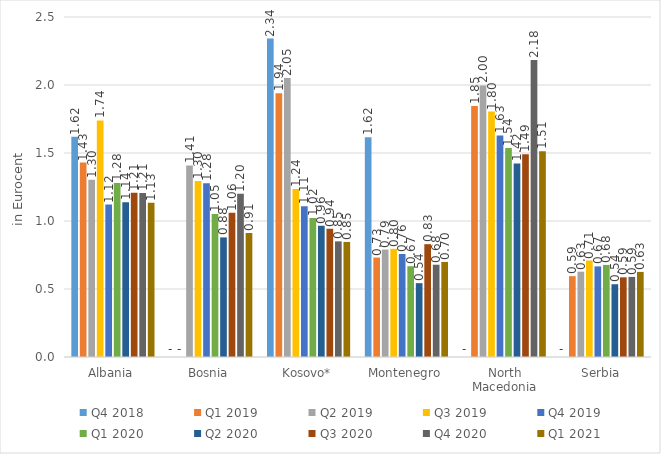
| Category | Q4 2018 | Q1 2019 | Q2 2019 | Q3 2019 | Q4 2019 | Q1 2020 | Q2 2020 | Q3 2020 | Q4 2020 | Q1 2021 |
|---|---|---|---|---|---|---|---|---|---|---|
| Albania | 1.62 | 1.43 | 1.304 | 1.74 | 1.121 | 1.28 | 1.139 | 1.208 | 1.206 | 1.134 |
| Bosnia | 0 | 0 | 1.409 | 1.295 | 1.277 | 1.051 | 0.879 | 1.06 | 1.2 | 0.912 |
| Kosovo* | 2.342 | 1.938 | 2.052 | 1.235 | 1.108 | 1.021 | 0.965 | 0.943 | 0.85 | 0.846 |
| Montenegro | 1.616 | 0.731 | 0.79 | 0.795 | 0.757 | 0.668 | 0.543 | 0.829 | 0.679 | 0.699 |
| North Macedonia | 0 | 1.846 | 1.997 | 1.805 | 1.629 | 1.536 | 1.423 | 1.491 | 2.183 | 1.514 |
| Serbia | 0 | 0.595 | 0.627 | 0.71 | 0.666 | 0.677 | 0.535 | 0.586 | 0.589 | 0.626 |